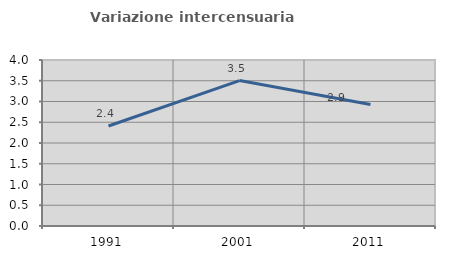
| Category | Variazione intercensuaria annua |
|---|---|
| 1991.0 | 2.411 |
| 2001.0 | 3.505 |
| 2011.0 | 2.929 |